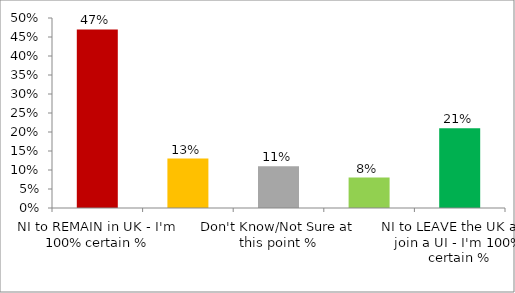
| Category | Share |
|---|---|
| NI to REMAIN in UK - I'm 100% certain % | 0.47 |
| NI to REMAIN in UK - My probable vote, but I'm not certain % | 0.13 |
| Don't Know/Not Sure at this point % | 0.11 |
| NI to LEAVE the UK and join a UI - My probable vote, but I'm not certain % | 0.08 |
| NI to LEAVE the UK and join a UI - I'm 100% certain % | 0.21 |